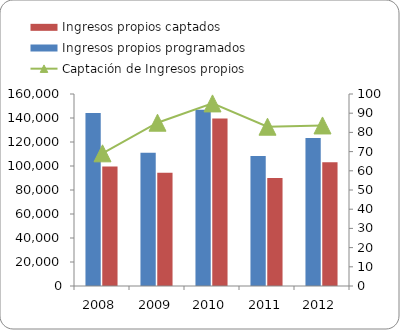
| Category | Ingresos propios programados | Ingresos propios captados  |
|---|---|---|
| 2008 | 144091 | 99570 |
| 2009 | 111000 | 94407 |
| 2010 | 146775 | 139593 |
| 2011 | 108380 | 89927 |
| 2012 | 123293.511 | 103097.75 |